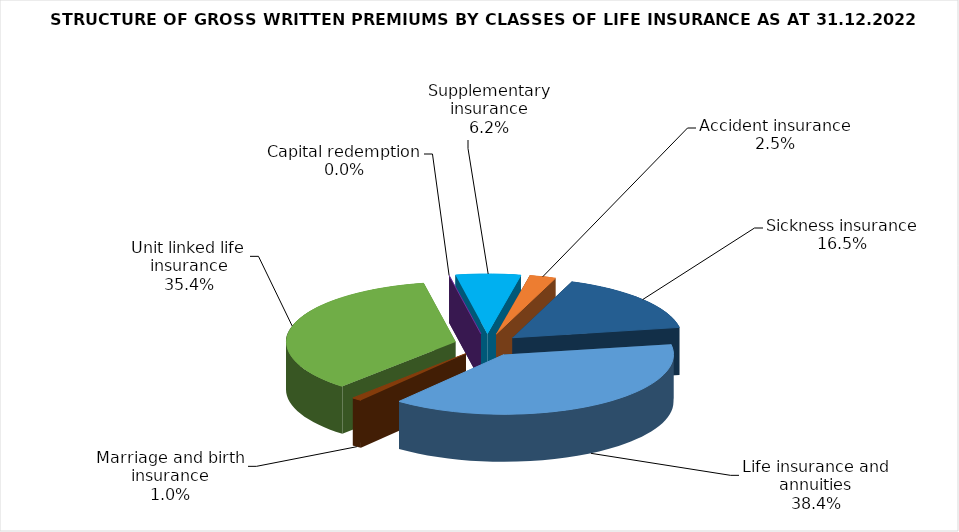
| Category | Life insurance and annuities |
|---|---|
| Life insurance and annuities | 240256248.54 |
| Marriage and birth insurance | 6186766.636 |
| Unit linked life insurance | 221133426.206 |
| Capital redemption | 0 |
| Supplementary insurance | 38686083.789 |
| Accident insurance | 15693504.97 |
| Sickness insurance | 103434310.2 |